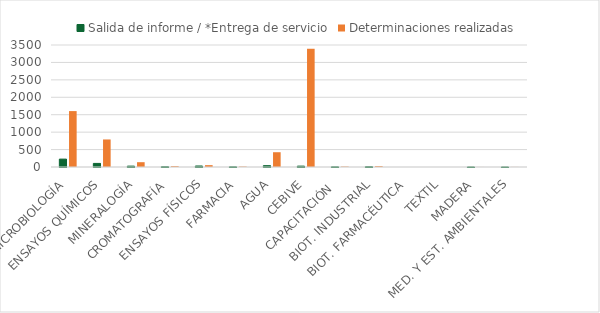
| Category | Salida de informe / *Entrega de servicio | Determinaciones realizadas |
|---|---|---|
| MICROBIOLOGÍA | 226 | 1604 |
| ENSAYOS QUÍMICOS | 103 | 790 |
| MINERALOGÍA | 25 | 138 |
| CROMATOGRAFÍA | 9 | 24 |
| ENSAYOS FÍSICOS | 29 | 53 |
| FARMACIA | 5 | 12 |
| AGUA | 38 | 424 |
| CEBIVE | 25 | 3392 |
| CAPACITACIÓN  | 5 | 12 |
| BIOT. INDUSTRIAL | 9 | 24 |
| BIOT. FARMACÉUTICA | 0 | 0 |
| TEXTIL | 0 | 0 |
| MADERA | 1 | 1 |
| MED. Y EST. AMBIENTALES | 1 | 2 |